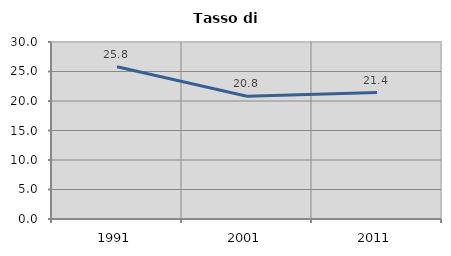
| Category | Tasso di disoccupazione   |
|---|---|
| 1991.0 | 25.812 |
| 2001.0 | 20.816 |
| 2011.0 | 21.437 |